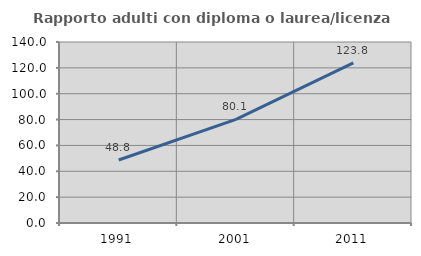
| Category | Rapporto adulti con diploma o laurea/licenza media  |
|---|---|
| 1991.0 | 48.754 |
| 2001.0 | 80.131 |
| 2011.0 | 123.843 |